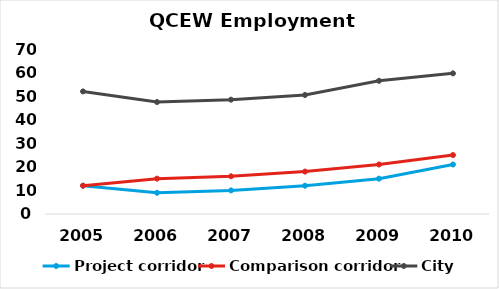
| Category | Project corridor | Comparison corridor | City |
|---|---|---|---|
| 2005.0 | 12 | 12 | 52 |
| 2006.0 | 9 | 15 | 47.5 |
| 2007.0 | 10 | 16 | 48.5 |
| 2008.0 | 12 | 18 | 50.5 |
| 2009.0 | 15 | 21 | 56.5 |
| 2010.0 | 21 | 25 | 59.667 |